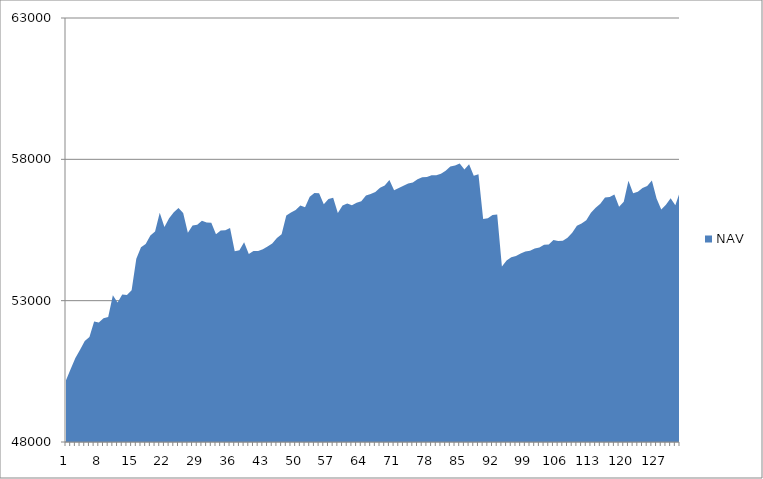
| Category | NAV |
|---|---|
| 0 | 50185.185 |
| 1 | 50585.185 |
| 2 | 50973.977 |
| 3 | 51265.977 |
| 4 | 51576.741 |
| 5 | 51711.523 |
| 6 | 52262.893 |
| 7 | 52230.24 |
| 8 | 52381.556 |
| 9 | 52425.915 |
| 10 | 53192.581 |
| 11 | 52939.146 |
| 12 | 53220.069 |
| 13 | 53197.341 |
| 14 | 53369.61 |
| 15 | 54480.721 |
| 16 | 54888.365 |
| 17 | 55001.902 |
| 18 | 55308.308 |
| 19 | 55448.308 |
| 20 | 56110.305 |
| 21 | 55610.305 |
| 22 | 55916.954 |
| 23 | 56129.798 |
| 24 | 56279.798 |
| 25 | 56105.301 |
| 26 | 55401.645 |
| 27 | 55657.201 |
| 28 | 55686.925 |
| 29 | 55823.001 |
| 30 | 55769.596 |
| 31 | 55759.375 |
| 32 | 55350.284 |
| 33 | 55480.284 |
| 34 | 55492.498 |
| 35 | 55570.42 |
| 36 | 54746.89 |
| 37 | 54783.7 |
| 38 | 55066.459 |
| 39 | 54651.074 |
| 40 | 54754.078 |
| 41 | 54760.213 |
| 42 | 54816.924 |
| 43 | 54917.296 |
| 44 | 55025.73 |
| 45 | 55220.535 |
| 46 | 55353.465 |
| 47 | 56009.309 |
| 48 | 56118.959 |
| 49 | 56205.212 |
| 50 | 56362.876 |
| 51 | 56307.394 |
| 52 | 56678.935 |
| 53 | 56813.264 |
| 54 | 56799.502 |
| 55 | 56409.112 |
| 56 | 56596.44 |
| 57 | 56640.493 |
| 58 | 56102.227 |
| 59 | 56370.449 |
| 60 | 56434.248 |
| 61 | 56376.841 |
| 62 | 56464.524 |
| 63 | 56518.022 |
| 64 | 56724.747 |
| 65 | 56770.361 |
| 66 | 56848.099 |
| 67 | 56992.896 |
| 68 | 57073.571 |
| 69 | 57266.481 |
| 70 | 56908.016 |
| 71 | 56984.939 |
| 72 | 57069.276 |
| 73 | 57147.627 |
| 74 | 57179.83 |
| 75 | 57291.17 |
| 76 | 57366.35 |
| 77 | 57371.599 |
| 78 | 57439.215 |
| 79 | 57440.895 |
| 80 | 57490.895 |
| 81 | 57593.679 |
| 82 | 57746.643 |
| 83 | 57785.413 |
| 84 | 57849.748 |
| 85 | 57639.346 |
| 86 | 57828.82 |
| 87 | 57417.055 |
| 88 | 57471.335 |
| 89 | 55888.376 |
| 90 | 55913.907 |
| 91 | 56031.989 |
| 92 | 56044.711 |
| 93 | 54210.631 |
| 94 | 54422.612 |
| 95 | 54536.647 |
| 96 | 54575.903 |
| 97 | 54670.229 |
| 98 | 54737.367 |
| 99 | 54762.386 |
| 100 | 54842.923 |
| 101 | 54881.385 |
| 102 | 54978.816 |
| 103 | 54991.283 |
| 104 | 55149.699 |
| 105 | 55109.498 |
| 106 | 55121.656 |
| 107 | 55227.569 |
| 108 | 55405.15 |
| 109 | 55650.183 |
| 110 | 55733.424 |
| 111 | 55846.244 |
| 112 | 56110.95 |
| 113 | 56283.172 |
| 114 | 56430.541 |
| 115 | 56648.489 |
| 116 | 56663.919 |
| 117 | 56752.272 |
| 118 | 56318.108 |
| 119 | 56496.442 |
| 120 | 57240.145 |
| 121 | 56797.081 |
| 122 | 56857.303 |
| 123 | 56985.874 |
| 124 | 57053.805 |
| 125 | 57249.117 |
| 126 | 56612.311 |
| 127 | 56221.507 |
| 128 | 56394.346 |
| 129 | 56622.008 |
| 130 | 56375.255 |
| 131 | 56862.384 |